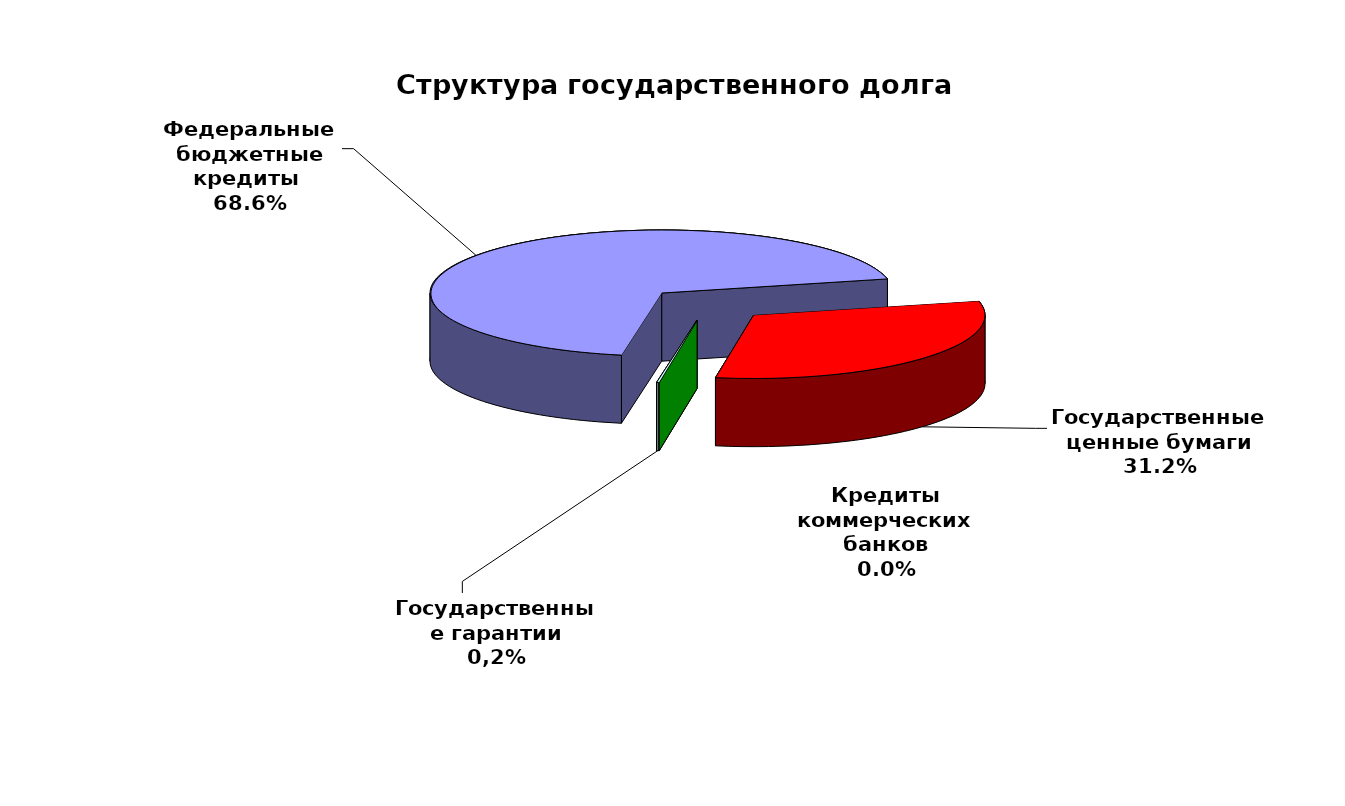
| Category | Series 0 |
|---|---|
| Федеральные бюджетные кредиты  | 91228290.06 |
| Государственные ценные бумаги | 41500000 |
| Кредиты коммерческих банков | 0 |
| Государственные гарантии | 217186.67 |